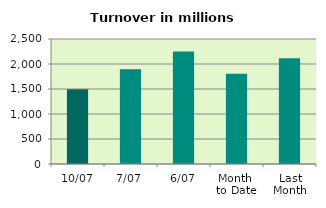
| Category | Series 0 |
|---|---|
| 10/07 | 1492.799 |
| 7/07 | 1894.215 |
| 6/07 | 2249.895 |
| Month 
to Date | 1804.095 |
| Last
Month | 2115.436 |